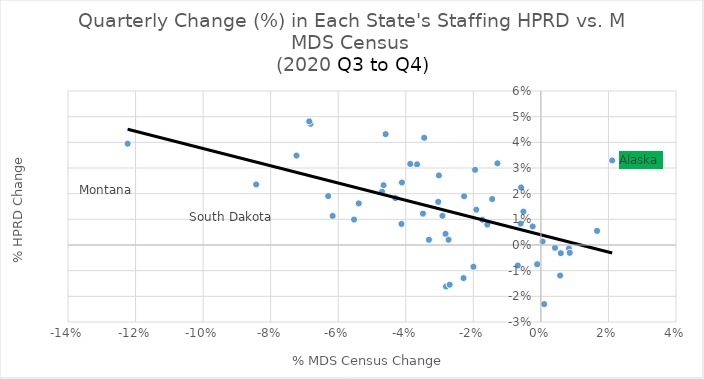
| Category | Field2 |
|---|---|
| 0.0211053330382828 | 0.033 |
| -0.017296594769385713 | 0.01 |
| -0.06819060897826898 | 0.047 |
| 0.00569236659497282 | -0.012 |
| 0.00418136070734018 | -0.001 |
| -0.028076410764302052 | -0.016 |
| 0.008294381390229378 | -0.001 |
| -0.028220455229789613 | 0.004 |
| 0.0009624496871081996 | -0.023 |
| 0.005899555491326917 | -0.003 |
| -0.02732925263563233 | 0.002 |
| -0.005993072030807563 | 0.008 |
| -0.0465760745083463 | 0.023 |
| -0.055314899843293235 | 0.01 |
| -0.03020133568154895 | 0.027 |
| -0.034541352157971626 | 0.042 |
| -0.06296673400411017 | 0.019 |
| -0.04597079344411211 | 0.043 |
| -0.012859778184517119 | 0.032 |
| 0.0005064309408559629 | 0.001 |
| 0.016630986495459715 | 0.005 |
| -0.0158657044140919 | 0.008 |
| -0.01949941294228448 | 0.029 |
| -0.03314481177842904 | 0.002 |
| -0.06858439971751312 | 0.048 |
| -0.00585049738997626 | 0.022 |
| -0.1223469905685011 | 0.039 |
| -0.030398714427790484 | 0.017 |
| -0.07235370648021942 | 0.035 |
| -0.053921052052497 | 0.016 |
| -0.04127661208546854 | 0.008 |
| 0.008550313334572453 | -0.003 |
| -0.027008902616419892 | -0.015 |
| -0.029143428796502356 | 0.011 |
| -0.006849193192452781 | -0.008 |
| -0.03666303636085178 | 0.031 |
| -0.047027717259885374 | 0.021 |
| -0.002429428764158798 | 0.007 |
| -0.034922580266794644 | 0.012 |
| -0.005169676180755073 | 0.013 |
| -0.014428287942558286 | 0.018 |
| -0.08429694060873559 | 0.024 |
| -0.04308382995698626 | 0.018 |
| -0.022733181807106765 | 0.019 |
| -0.0011034318713418324 | -0.007 |
| -0.01913907278094868 | 0.014 |
| -0.01997145441332514 | -0.008 |
| -0.022891619893314435 | -0.013 |
| -0.0616472682364058 | 0.011 |
| -0.03867986543484342 | 0.032 |
| -0.04114656403447234 | 0.024 |